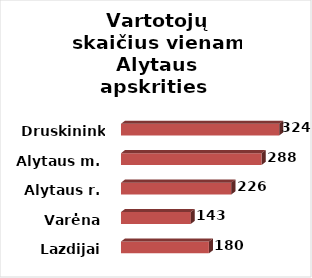
| Category | Series 0 |
|---|---|
| Lazdijai | 180 |
| Varėna | 143 |
| Alytaus r. | 226 |
| Alytaus m. | 288 |
| Druskininkai | 324 |